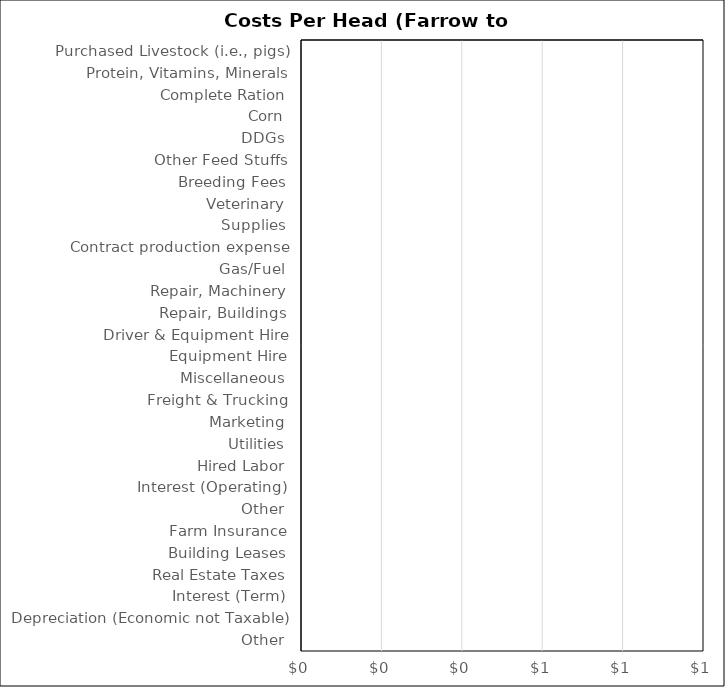
| Category | Beef Cow Calf |
|---|---|
| Purchased Livestock (i.e., pigs) | 0 |
| Protein, Vitamins, Minerals | 0 |
| Complete Ration | 0 |
| Corn | 0 |
| DDGs | 0 |
| Other Feed Stuffs | 0 |
| Breeding Fees | 0 |
| Veterinary | 0 |
| Supplies | 0 |
| Contract production expense | 0 |
| Gas/Fuel | 0 |
| Repair, Machinery | 0 |
| Repair, Buildings | 0 |
| Driver & Equipment Hire | 0 |
| Equipment Hire | 0 |
| Miscellaneous | 0 |
| Freight & Trucking | 0 |
| Marketing | 0 |
| Utilities | 0 |
| Hired Labor | 0 |
| Interest (Operating) | 0 |
| Other | 0 |
| Farm Insurance | 0 |
| Building Leases | 0 |
| Real Estate Taxes | 0 |
| Interest (Term) | 0 |
| Depreciation (Economic not Taxable) | 0 |
| Other | 0 |